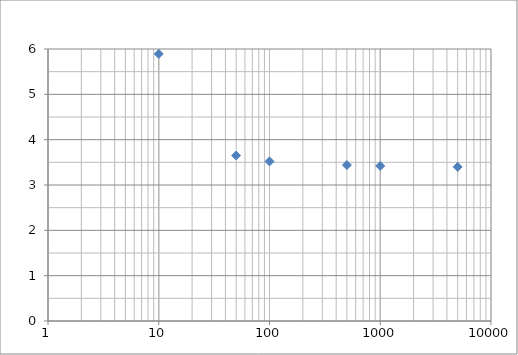
| Category | Series 0 |
|---|---|
| 10.0 | 5.89 |
| 50.0 | 3.65 |
| 100.0 | 3.52 |
| 500.0 | 3.44 |
| 1000.0 | 3.42 |
| 5000.0 | 3.4 |